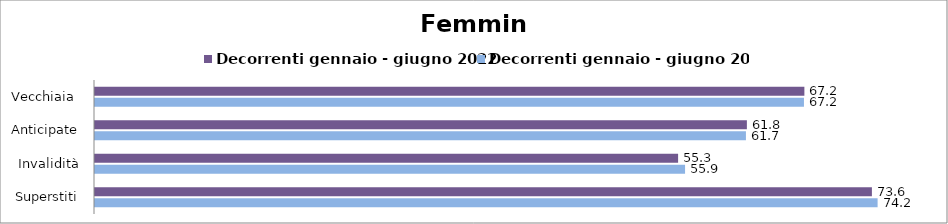
| Category | Decorrenti gennaio - giugno 2022 | Decorrenti gennaio - giugno 2023 |
|---|---|---|
| Vecchiaia  | 67.24 | 67.2 |
| Anticipate | 61.79 | 61.7 |
| Invalidità | 55.27 | 55.93 |
| Superstiti | 73.64 | 74.18 |